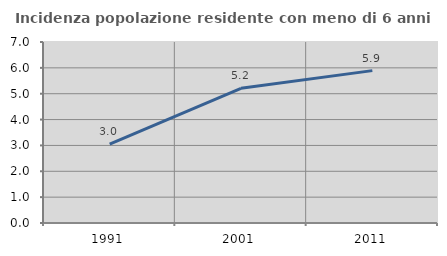
| Category | Incidenza popolazione residente con meno di 6 anni |
|---|---|
| 1991.0 | 3.05 |
| 2001.0 | 5.208 |
| 2011.0 | 5.893 |